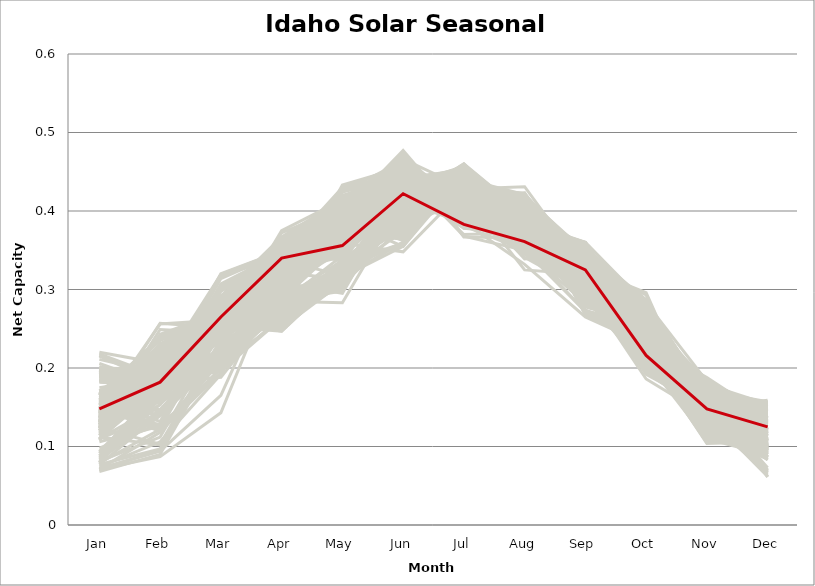
| Category | sample_001 | sample_002 | sample_003 | sample_004 | sample_005 | sample_006 | sample_007 | sample_008 | sample_009 | sample_010 | sample_011 | sample_012 | sample_013 | sample_014 | sample_015 | sample_016 | sample_017 | sample_018 | sample_019 | sample_020 | sample_021 | sample_022 | sample_023 | sample_024 | sample_025 | sample_026 | sample_027 | sample_028 | sample_029 | sample_030 | sample_031 | sample_032 | sample_033 | sample_034 | sample_035 | sample_036 | sample_037 | sample_038 | sample_039 | sample_040 | sample_041 | sample_042 | sample_043 | sample_044 | sample_045 | sample_046 | sample_047 | sample_048 | sample_049 | sample_050 | sample_051 | sample_052 | sample_053 | sample_054 | sample_055 | sample_056 | sample_057 | sample_058 | sample_059 | sample_060 | sample_061 | sample_062 | sample_063 | sample_064 | sample_065 | sample_066 | sample_067 | sample_068 | sample_069 | sample_070 | sample_071 | sample_072 | sample_073 | sample_074 | sample_075 | sample_076 | sample_077 | sample_078 | sample_079 | sample_080 | sample_081 | sample_082 | sample_083 | sample_084 | sample_085 | sample_086 | sample_087 | sample_088 | sample_089 | sample_090 | sample_091 | sample_092 | sample_093 | sample_094 | sample_095 | sample_096 | sample_097 | sample_098 | sample_099 | sample_100 | sample_101 | sample_102 | sample_103 | sample_104 | sample_105 | sample_106 | sample_107 | sample_108 | sample_109 | sample_110 | sample_111 | sample_112 | sample_113 | sample_114 | sample_115 | sample_116 | sample_117 | sample_118 | sample_119 | sample_120 | sample_121 | sample_122 | sample_123 | sample_124 | sample_125 | sample_126 | sample_127 | sample_128 | sample_129 | sample_130 | sample_131 | sample_132 | sample_133 | sample_134 | sample_135 | sample_136 | sample_137 | sample_138 | sample_139 | sample_140 | sample_141 | sample_142 | sample_143 | sample_144 | sample_145 | sample_146 | sample_147 | sample_148 | sample_149 | sample_150 | sample_151 | sample_152 | sample_153 | sample_154 | sample_155 | sample_156 | sample_157 | sample_158 | sample_159 | sample_160 | sample_161 | sample_162 | sample_163 | sample_164 | sample_165 | sample_166 | sample_167 | sample_168 | sample_169 | sample_170 | sample_171 | sample_172 | sample_173 | sample_174 | sample_175 | sample_176 | sample_177 | sample_178 | sample_179 | sample_180 | sample_181 | sample_183 | sample_184 | sample_185 | sample_186 | sample_187 | sample_188 | sample_189 | sample_190 | sample_191 | sample_192 | sample_193 | sample_194 | sample_195 | sample_196 | sample_197 | sample_198 | sample_199 | sample_200 | sample_201 | sample_202 | sample_203 | sample_204 | sample_205 | sample_206 | sample_207 | sample_208 | sample_209 | sample_210 | sample_211 | sample_212 | sample_213 | sample_214 | sample_215 | sample_216 | sample_217 | sample_218 | sample_219 | sample_220 | sample_221 | sample_222 | sample_223 | sample_224 | sample_225 | sample_226 | sample_227 | sample_228 | sample_229 | sample_230 | sample_231 | sample_232 | sample_233 | sample_234 | sample_235 | sample_236 | sample_237 | sample_238 | sample_239 | sample_240 | sample_241 | sample_242 | sample_243 | sample_244 | sample_245 | sample_246 | sample_247 | sample_248 | sample_249 | sample_250 | sample_182 |
|---|---|---|---|---|---|---|---|---|---|---|---|---|---|---|---|---|---|---|---|---|---|---|---|---|---|---|---|---|---|---|---|---|---|---|---|---|---|---|---|---|---|---|---|---|---|---|---|---|---|---|---|---|---|---|---|---|---|---|---|---|---|---|---|---|---|---|---|---|---|---|---|---|---|---|---|---|---|---|---|---|---|---|---|---|---|---|---|---|---|---|---|---|---|---|---|---|---|---|---|---|---|---|---|---|---|---|---|---|---|---|---|---|---|---|---|---|---|---|---|---|---|---|---|---|---|---|---|---|---|---|---|---|---|---|---|---|---|---|---|---|---|---|---|---|---|---|---|---|---|---|---|---|---|---|---|---|---|---|---|---|---|---|---|---|---|---|---|---|---|---|---|---|---|---|---|---|---|---|---|---|---|---|---|---|---|---|---|---|---|---|---|---|---|---|---|---|---|---|---|---|---|---|---|---|---|---|---|---|---|---|---|---|---|---|---|---|---|---|---|---|---|---|---|---|---|---|---|---|---|---|---|---|---|---|---|---|---|---|---|---|---|---|---|---|---|---|---|---|---|---|
| Jan | 0.11 | 0.167 | 0.142 | 0.191 | 0.166 | 0.171 | 0.114 | 0.192 | 0.164 | 0.079 | 0.137 | 0.138 | 0.163 | 0.128 | 0.199 | 0.142 | 0.15 | 0.182 | 0.185 | 0.12 | 0.137 | 0.12 | 0.133 | 0.169 | 0.159 | 0.132 | 0.132 | 0.166 | 0.143 | 0.127 | 0.137 | 0.126 | 0.124 | 0.117 | 0.145 | 0.147 | 0.131 | 0.143 | 0.124 | 0.215 | 0.138 | 0.149 | 0.188 | 0.166 | 0.145 | 0.109 | 0.2 | 0.199 | 0.079 | 0.155 | 0.131 | 0.116 | 0.141 | 0.159 | 0.16 | 0.216 | 0.211 | 0.136 | 0.152 | 0.13 | 0.098 | 0.124 | 0.13 | 0.123 | 0.146 | 0.109 | 0.077 | 0.154 | 0.132 | 0.148 | 0.133 | 0.153 | 0.126 | 0.091 | 0.169 | 0.146 | 0.093 | 0.156 | 0.162 | 0.132 | 0.192 | 0.138 | 0.184 | 0.195 | 0.134 | 0.171 | 0.088 | 0.191 | 0.147 | 0.132 | 0.133 | 0.137 | 0.142 | 0.123 | 0.157 | 0.132 | 0.189 | 0.094 | 0.159 | 0.142 | 0.071 | 0.068 | 0.121 | 0.128 | 0.138 | 0.13 | 0.11 | 0.145 | 0.112 | 0.22 | 0.147 | 0.19 | 0.202 | 0.197 | 0.171 | 0.131 | 0.121 | 0.12 | 0.14 | 0.11 | 0.125 | 0.13 | 0.167 | 0.149 | 0.149 | 0.128 | 0.129 | 0.136 | 0.135 | 0.154 | 0.196 | 0.083 | 0.077 | 0.175 | 0.127 | 0.074 | 0.118 | 0.072 | 0.126 | 0.165 | 0.135 | 0.131 | 0.141 | 0.206 | 0.157 | 0.148 | 0.158 | 0.132 | 0.144 | 0.13 | 0.14 | 0.114 | 0.128 | 0.12 | 0.197 | 0.071 | 0.132 | 0.135 | 0.15 | 0.153 | 0.123 | 0.218 | 0.158 | 0.132 | 0.135 | 0.131 | 0.137 | 0.132 | 0.152 | 0.2 | 0.08 | 0.14 | 0.139 | 0.133 | 0.134 | 0.08 | 0.146 | 0.13 | 0.158 | 0.135 | 0.128 | 0.141 | 0.136 | 0.157 | 0.124 | 0.135 | 0.171 | 0.143 | 0.137 | 0.143 | 0.159 | 0.123 | 0.071 | 0.153 | 0.125 | 0.165 | 0.135 | 0.136 | 0.165 | 0.133 | 0.11 | 0.136 | 0.163 | 0.14 | 0.131 | 0.132 | 0.164 | 0.185 | 0.146 | 0.171 | 0.135 | 0.154 | 0.135 | 0.144 | 0.139 | 0.124 | 0.106 | 0.13 | 0.156 | 0.137 | 0.143 | 0.12 | 0.144 | 0.132 | 0.13 | 0.124 | 0.153 | 0.149 | 0.153 | 0.081 | 0.084 | 0.086 | 0.108 | 0.131 | 0.147 | 0.149 | 0.171 | 0.126 | 0.195 | 0.198 | 0.123 | 0.165 | 0.125 | 0.088 | 0.123 | 0.183 | 0.164 | 0.165 | 0.139 | 0.148 |
| Feb | 0.14 | 0.198 | 0.24 | 0.194 | 0.214 | 0.171 | 0.197 | 0.164 | 0.184 | 0.122 | 0.221 | 0.209 | 0.189 | 0.249 | 0.178 | 0.221 | 0.119 | 0.178 | 0.169 | 0.208 | 0.166 | 0.191 | 0.222 | 0.172 | 0.183 | 0.202 | 0.179 | 0.205 | 0.213 | 0.215 | 0.167 | 0.18 | 0.103 | 0.181 | 0.178 | 0.213 | 0.213 | 0.211 | 0.179 | 0.185 | 0.178 | 0.186 | 0.196 | 0.238 | 0.24 | 0.191 | 0.182 | 0.172 | 0.161 | 0.172 | 0.205 | 0.198 | 0.195 | 0.209 | 0.23 | 0.179 | 0.193 | 0.2 | 0.18 | 0.167 | 0.129 | 0.209 | 0.198 | 0.197 | 0.141 | 0.18 | 0.141 | 0.225 | 0.217 | 0.215 | 0.175 | 0.126 | 0.185 | 0.178 | 0.192 | 0.229 | 0.168 | 0.197 | 0.178 | 0.163 | 0.188 | 0.172 | 0.193 | 0.155 | 0.198 | 0.187 | 0.147 | 0.188 | 0.182 | 0.191 | 0.186 | 0.197 | 0.218 | 0.212 | 0.209 | 0.207 | 0.168 | 0.171 | 0.215 | 0.17 | 0.118 | 0.09 | 0.216 | 0.191 | 0.19 | 0.18 | 0.175 | 0.179 | 0.102 | 0.206 | 0.156 | 0.164 | 0.185 | 0.159 | 0.176 | 0.165 | 0.171 | 0.189 | 0.19 | 0.18 | 0.214 | 0.176 | 0.239 | 0.19 | 0.218 | 0.217 | 0.197 | 0.168 | 0.178 | 0.188 | 0.178 | 0.139 | 0.097 | 0.188 | 0.186 | 0.106 | 0.188 | 0.094 | 0.161 | 0.199 | 0.179 | 0.189 | 0.173 | 0.178 | 0.181 | 0.126 | 0.185 | 0.177 | 0.256 | 0.177 | 0.216 | 0.191 | 0.243 | 0.194 | 0.204 | 0.095 | 0.17 | 0.183 | 0.183 | 0.179 | 0.212 | 0.189 | 0.181 | 0.21 | 0.183 | 0.223 | 0.191 | 0.221 | 0.219 | 0.198 | 0.162 | 0.168 | 0.169 | 0.186 | 0.181 | 0.169 | 0.186 | 0.227 | 0.18 | 0.165 | 0.203 | 0.178 | 0.183 | 0.132 | 0.183 | 0.191 | 0.177 | 0.173 | 0.203 | 0.128 | 0.122 | 0.188 | 0.087 | 0.23 | 0.212 | 0.237 | 0.215 | 0.176 | 0.123 | 0.158 | 0.153 | 0.188 | 0.167 | 0.228 | 0.196 | 0.183 | 0.184 | 0.199 | 0.164 | 0.166 | 0.173 | 0.14 | 0.161 | 0.182 | 0.198 | 0.177 | 0.126 | 0.198 | 0.145 | 0.257 | 0.209 | 0.215 | 0.176 | 0.205 | 0.187 | 0.175 | 0.179 | 0.21 | 0.147 | 0.112 | 0.143 | 0.154 | 0.194 | 0.19 | 0.124 | 0.182 | 0.218 | 0.159 | 0.166 | 0.168 | 0.182 | 0.235 | 0.194 | 0.166 | 0.174 | 0.168 | 0.186 | 0.195 | 0.231 | 0.182 |
| Mar | 0.277 | 0.319 | 0.263 | 0.26 | 0.282 | 0.21 | 0.253 | 0.284 | 0.256 | 0.213 | 0.273 | 0.251 | 0.273 | 0.245 | 0.284 | 0.255 | 0.194 | 0.283 | 0.279 | 0.265 | 0.282 | 0.255 | 0.255 | 0.287 | 0.271 | 0.27 | 0.214 | 0.26 | 0.253 | 0.266 | 0.263 | 0.252 | 0.237 | 0.273 | 0.316 | 0.258 | 0.25 | 0.255 | 0.272 | 0.292 | 0.213 | 0.269 | 0.265 | 0.274 | 0.269 | 0.26 | 0.285 | 0.278 | 0.225 | 0.304 | 0.26 | 0.259 | 0.255 | 0.276 | 0.261 | 0.29 | 0.286 | 0.285 | 0.259 | 0.25 | 0.262 | 0.255 | 0.25 | 0.264 | 0.242 | 0.246 | 0.21 | 0.265 | 0.258 | 0.263 | 0.271 | 0.268 | 0.223 | 0.24 | 0.303 | 0.276 | 0.225 | 0.259 | 0.258 | 0.258 | 0.28 | 0.25 | 0.271 | 0.282 | 0.257 | 0.259 | 0.23 | 0.273 | 0.259 | 0.254 | 0.201 | 0.259 | 0.249 | 0.247 | 0.268 | 0.269 | 0.276 | 0.239 | 0.282 | 0.298 | 0.209 | 0.227 | 0.271 | 0.241 | 0.201 | 0.199 | 0.255 | 0.32 | 0.229 | 0.282 | 0.217 | 0.277 | 0.281 | 0.277 | 0.268 | 0.274 | 0.254 | 0.199 | 0.249 | 0.247 | 0.274 | 0.301 | 0.268 | 0.318 | 0.24 | 0.252 | 0.264 | 0.3 | 0.264 | 0.268 | 0.283 | 0.229 | 0.23 | 0.281 | 0.209 | 0.192 | 0.263 | 0.165 | 0.255 | 0.271 | 0.317 | 0.27 | 0.201 | 0.279 | 0.264 | 0.26 | 0.201 | 0.259 | 0.261 | 0.259 | 0.258 | 0.256 | 0.271 | 0.263 | 0.282 | 0.232 | 0.271 | 0.276 | 0.197 | 0.204 | 0.252 | 0.291 | 0.258 | 0.275 | 0.261 | 0.262 | 0.266 | 0.25 | 0.252 | 0.281 | 0.237 | 0.298 | 0.284 | 0.26 | 0.258 | 0.251 | 0.21 | 0.269 | 0.3 | 0.301 | 0.247 | 0.314 | 0.253 | 0.266 | 0.196 | 0.257 | 0.269 | 0.207 | 0.261 | 0.193 | 0.2 | 0.282 | 0.143 | 0.269 | 0.243 | 0.255 | 0.258 | 0.263 | 0.257 | 0.265 | 0.257 | 0.256 | 0.207 | 0.272 | 0.263 | 0.248 | 0.271 | 0.284 | 0.252 | 0.272 | 0.307 | 0.21 | 0.28 | 0.188 | 0.281 | 0.248 | 0.255 | 0.249 | 0.215 | 0.251 | 0.269 | 0.26 | 0.205 | 0.271 | 0.268 | 0.244 | 0.203 | 0.27 | 0.206 | 0.246 | 0.221 | 0.224 | 0.268 | 0.2 | 0.199 | 0.208 | 0.276 | 0.257 | 0.291 | 0.279 | 0.26 | 0.267 | 0.255 | 0.249 | 0.255 | 0.278 | 0.206 | 0.317 | 0.267 | 0.265 |
| Apr | 0.348 | 0.349 | 0.345 | 0.301 | 0.357 | 0.309 | 0.247 | 0.359 | 0.315 | 0.292 | 0.316 | 0.261 | 0.313 | 0.375 | 0.352 | 0.293 | 0.309 | 0.306 | 0.35 | 0.291 | 0.338 | 0.256 | 0.282 | 0.311 | 0.308 | 0.316 | 0.275 | 0.315 | 0.291 | 0.332 | 0.324 | 0.331 | 0.296 | 0.29 | 0.348 | 0.251 | 0.271 | 0.29 | 0.323 | 0.349 | 0.282 | 0.341 | 0.3 | 0.333 | 0.348 | 0.248 | 0.354 | 0.356 | 0.298 | 0.346 | 0.247 | 0.254 | 0.334 | 0.346 | 0.344 | 0.345 | 0.356 | 0.282 | 0.33 | 0.321 | 0.333 | 0.33 | 0.267 | 0.283 | 0.335 | 0.287 | 0.283 | 0.34 | 0.335 | 0.344 | 0.306 | 0.356 | 0.279 | 0.274 | 0.326 | 0.336 | 0.28 | 0.349 | 0.314 | 0.321 | 0.327 | 0.323 | 0.289 | 0.365 | 0.332 | 0.326 | 0.283 | 0.296 | 0.294 | 0.335 | 0.263 | 0.263 | 0.287 | 0.271 | 0.352 | 0.28 | 0.34 | 0.287 | 0.365 | 0.35 | 0.3 | 0.327 | 0.31 | 0.343 | 0.274 | 0.264 | 0.259 | 0.349 | 0.293 | 0.354 | 0.323 | 0.351 | 0.346 | 0.358 | 0.301 | 0.348 | 0.32 | 0.264 | 0.34 | 0.298 | 0.326 | 0.348 | 0.338 | 0.341 | 0.28 | 0.279 | 0.347 | 0.335 | 0.302 | 0.3 | 0.357 | 0.282 | 0.329 | 0.31 | 0.269 | 0.318 | 0.252 | 0.336 | 0.317 | 0.287 | 0.346 | 0.311 | 0.279 | 0.36 | 0.305 | 0.32 | 0.293 | 0.298 | 0.364 | 0.249 | 0.294 | 0.257 | 0.353 | 0.319 | 0.323 | 0.326 | 0.337 | 0.34 | 0.29 | 0.323 | 0.33 | 0.344 | 0.313 | 0.346 | 0.339 | 0.288 | 0.351 | 0.278 | 0.28 | 0.343 | 0.289 | 0.34 | 0.337 | 0.352 | 0.311 | 0.293 | 0.289 | 0.353 | 0.331 | 0.336 | 0.263 | 0.348 | 0.293 | 0.358 | 0.263 | 0.351 | 0.291 | 0.286 | 0.337 | 0.311 | 0.315 | 0.29 | 0.333 | 0.345 | 0.269 | 0.343 | 0.285 | 0.256 | 0.313 | 0.347 | 0.337 | 0.336 | 0.302 | 0.339 | 0.341 | 0.293 | 0.298 | 0.304 | 0.312 | 0.311 | 0.347 | 0.332 | 0.33 | 0.286 | 0.301 | 0.325 | 0.324 | 0.265 | 0.325 | 0.372 | 0.358 | 0.33 | 0.277 | 0.344 | 0.344 | 0.292 | 0.296 | 0.347 | 0.333 | 0.311 | 0.286 | 0.284 | 0.284 | 0.279 | 0.307 | 0.285 | 0.354 | 0.336 | 0.367 | 0.364 | 0.299 | 0.34 | 0.337 | 0.296 | 0.252 | 0.337 | 0.285 | 0.345 | 0.331 | 0.34 |
| May | 0.359 | 0.358 | 0.407 | 0.377 | 0.346 | 0.295 | 0.32 | 0.416 | 0.364 | 0.365 | 0.407 | 0.306 | 0.384 | 0.414 | 0.404 | 0.317 | 0.368 | 0.397 | 0.409 | 0.411 | 0.359 | 0.332 | 0.323 | 0.414 | 0.415 | 0.368 | 0.328 | 0.35 | 0.314 | 0.416 | 0.381 | 0.38 | 0.413 | 0.388 | 0.366 | 0.309 | 0.328 | 0.328 | 0.342 | 0.424 | 0.311 | 0.365 | 0.373 | 0.383 | 0.412 | 0.337 | 0.399 | 0.42 | 0.391 | 0.369 | 0.32 | 0.333 | 0.391 | 0.351 | 0.366 | 0.43 | 0.412 | 0.424 | 0.371 | 0.366 | 0.41 | 0.383 | 0.331 | 0.418 | 0.365 | 0.373 | 0.343 | 0.387 | 0.387 | 0.34 | 0.394 | 0.369 | 0.326 | 0.405 | 0.356 | 0.41 | 0.38 | 0.354 | 0.379 | 0.373 | 0.403 | 0.389 | 0.361 | 0.41 | 0.397 | 0.361 | 0.373 | 0.377 | 0.37 | 0.385 | 0.31 | 0.325 | 0.331 | 0.337 | 0.36 | 0.407 | 0.403 | 0.41 | 0.343 | 0.365 | 0.37 | 0.405 | 0.411 | 0.381 | 0.308 | 0.313 | 0.333 | 0.371 | 0.419 | 0.412 | 0.379 | 0.411 | 0.427 | 0.416 | 0.399 | 0.348 | 0.382 | 0.32 | 0.38 | 0.373 | 0.414 | 0.372 | 0.377 | 0.36 | 0.327 | 0.316 | 0.375 | 0.375 | 0.394 | 0.375 | 0.4 | 0.382 | 0.403 | 0.407 | 0.322 | 0.402 | 0.329 | 0.391 | 0.375 | 0.359 | 0.369 | 0.349 | 0.303 | 0.397 | 0.382 | 0.361 | 0.298 | 0.383 | 0.399 | 0.316 | 0.321 | 0.339 | 0.415 | 0.366 | 0.39 | 0.399 | 0.318 | 0.376 | 0.301 | 0.312 | 0.377 | 0.415 | 0.385 | 0.368 | 0.396 | 0.337 | 0.394 | 0.317 | 0.303 | 0.39 | 0.408 | 0.368 | 0.359 | 0.375 | 0.367 | 0.426 | 0.31 | 0.409 | 0.353 | 0.377 | 0.339 | 0.369 | 0.372 | 0.393 | 0.305 | 0.384 | 0.399 | 0.314 | 0.4 | 0.379 | 0.358 | 0.433 | 0.372 | 0.383 | 0.331 | 0.376 | 0.321 | 0.316 | 0.374 | 0.373 | 0.402 | 0.39 | 0.309 | 0.385 | 0.367 | 0.372 | 0.409 | 0.386 | 0.371 | 0.402 | 0.369 | 0.35 | 0.367 | 0.298 | 0.35 | 0.373 | 0.411 | 0.324 | 0.364 | 0.405 | 0.341 | 0.39 | 0.304 | 0.358 | 0.373 | 0.367 | 0.304 | 0.355 | 0.358 | 0.397 | 0.371 | 0.376 | 0.428 | 0.309 | 0.367 | 0.302 | 0.336 | 0.367 | 0.415 | 0.412 | 0.384 | 0.374 | 0.397 | 0.429 | 0.333 | 0.401 | 0.283 | 0.359 | 0.403 | 0.356 |
| Jun | 0.466 | 0.414 | 0.454 | 0.372 | 0.442 | 0.429 | 0.384 | 0.446 | 0.405 | 0.435 | 0.453 | 0.381 | 0.384 | 0.44 | 0.448 | 0.422 | 0.449 | 0.4 | 0.446 | 0.46 | 0.432 | 0.377 | 0.423 | 0.444 | 0.436 | 0.41 | 0.407 | 0.411 | 0.431 | 0.466 | 0.424 | 0.463 | 0.423 | 0.355 | 0.412 | 0.38 | 0.411 | 0.427 | 0.414 | 0.464 | 0.411 | 0.439 | 0.37 | 0.434 | 0.461 | 0.38 | 0.449 | 0.443 | 0.443 | 0.424 | 0.374 | 0.377 | 0.47 | 0.44 | 0.415 | 0.458 | 0.44 | 0.443 | 0.425 | 0.438 | 0.447 | 0.412 | 0.388 | 0.444 | 0.456 | 0.374 | 0.431 | 0.434 | 0.416 | 0.44 | 0.368 | 0.445 | 0.412 | 0.442 | 0.422 | 0.452 | 0.438 | 0.426 | 0.404 | 0.417 | 0.448 | 0.405 | 0.381 | 0.443 | 0.477 | 0.415 | 0.442 | 0.381 | 0.366 | 0.464 | 0.396 | 0.382 | 0.413 | 0.396 | 0.432 | 0.439 | 0.45 | 0.445 | 0.449 | 0.419 | 0.437 | 0.454 | 0.466 | 0.466 | 0.396 | 0.397 | 0.359 | 0.415 | 0.421 | 0.445 | 0.454 | 0.443 | 0.444 | 0.439 | 0.381 | 0.434 | 0.441 | 0.397 | 0.459 | 0.379 | 0.459 | 0.415 | 0.428 | 0.415 | 0.398 | 0.421 | 0.43 | 0.426 | 0.362 | 0.38 | 0.446 | 0.441 | 0.45 | 0.44 | 0.404 | 0.444 | 0.384 | 0.446 | 0.426 | 0.348 | 0.414 | 0.412 | 0.414 | 0.443 | 0.372 | 0.428 | 0.422 | 0.376 | 0.449 | 0.355 | 0.432 | 0.383 | 0.456 | 0.412 | 0.447 | 0.457 | 0.445 | 0.434 | 0.419 | 0.425 | 0.419 | 0.462 | 0.374 | 0.442 | 0.474 | 0.434 | 0.474 | 0.426 | 0.429 | 0.444 | 0.449 | 0.423 | 0.438 | 0.471 | 0.412 | 0.445 | 0.425 | 0.459 | 0.427 | 0.43 | 0.392 | 0.417 | 0.375 | 0.417 | 0.394 | 0.471 | 0.377 | 0.411 | 0.468 | 0.434 | 0.435 | 0.456 | 0.434 | 0.421 | 0.396 | 0.419 | 0.426 | 0.36 | 0.389 | 0.428 | 0.448 | 0.473 | 0.436 | 0.444 | 0.427 | 0.364 | 0.38 | 0.432 | 0.395 | 0.378 | 0.413 | 0.444 | 0.425 | 0.42 | 0.407 | 0.462 | 0.43 | 0.36 | 0.448 | 0.437 | 0.444 | 0.411 | 0.411 | 0.438 | 0.425 | 0.368 | 0.429 | 0.446 | 0.46 | 0.444 | 0.433 | 0.439 | 0.449 | 0.403 | 0.44 | 0.407 | 0.443 | 0.427 | 0.443 | 0.439 | 0.365 | 0.433 | 0.469 | 0.447 | 0.356 | 0.448 | 0.414 | 0.41 | 0.457 | 0.422 |
| Jul | 0.43 | 0.397 | 0.405 | 0.444 | 0.441 | 0.395 | 0.44 | 0.413 | 0.437 | 0.453 | 0.411 | 0.414 | 0.441 | 0.41 | 0.42 | 0.43 | 0.397 | 0.431 | 0.426 | 0.417 | 0.394 | 0.442 | 0.422 | 0.427 | 0.434 | 0.458 | 0.442 | 0.441 | 0.423 | 0.4 | 0.382 | 0.391 | 0.397 | 0.446 | 0.398 | 0.419 | 0.44 | 0.42 | 0.451 | 0.383 | 0.444 | 0.43 | 0.437 | 0.433 | 0.405 | 0.448 | 0.416 | 0.399 | 0.444 | 0.39 | 0.443 | 0.441 | 0.391 | 0.435 | 0.442 | 0.383 | 0.395 | 0.41 | 0.437 | 0.393 | 0.399 | 0.456 | 0.445 | 0.424 | 0.386 | 0.442 | 0.457 | 0.429 | 0.451 | 0.436 | 0.44 | 0.386 | 0.444 | 0.43 | 0.399 | 0.403 | 0.446 | 0.433 | 0.434 | 0.388 | 0.421 | 0.441 | 0.437 | 0.414 | 0.387 | 0.434 | 0.452 | 0.436 | 0.442 | 0.395 | 0.436 | 0.441 | 0.431 | 0.441 | 0.441 | 0.417 | 0.426 | 0.427 | 0.426 | 0.4 | 0.455 | 0.417 | 0.412 | 0.4 | 0.438 | 0.444 | 0.458 | 0.397 | 0.406 | 0.387 | 0.39 | 0.425 | 0.394 | 0.402 | 0.439 | 0.387 | 0.401 | 0.446 | 0.383 | 0.43 | 0.406 | 0.399 | 0.437 | 0.395 | 0.423 | 0.432 | 0.443 | 0.397 | 0.445 | 0.437 | 0.418 | 0.445 | 0.411 | 0.43 | 0.445 | 0.423 | 0.443 | 0.427 | 0.379 | 0.427 | 0.401 | 0.455 | 0.442 | 0.403 | 0.448 | 0.423 | 0.419 | 0.433 | 0.407 | 0.451 | 0.427 | 0.451 | 0.402 | 0.46 | 0.425 | 0.408 | 0.37 | 0.434 | 0.432 | 0.408 | 0.451 | 0.384 | 0.448 | 0.441 | 0.389 | 0.424 | 0.378 | 0.428 | 0.415 | 0.416 | 0.425 | 0.396 | 0.384 | 0.367 | 0.385 | 0.425 | 0.424 | 0.397 | 0.39 | 0.4 | 0.441 | 0.391 | 0.431 | 0.415 | 0.449 | 0.389 | 0.441 | 0.442 | 0.399 | 0.41 | 0.388 | 0.411 | 0.428 | 0.435 | 0.444 | 0.44 | 0.429 | 0.453 | 0.423 | 0.385 | 0.404 | 0.387 | 0.403 | 0.433 | 0.441 | 0.435 | 0.445 | 0.426 | 0.439 | 0.45 | 0.394 | 0.381 | 0.391 | 0.431 | 0.453 | 0.41 | 0.405 | 0.457 | 0.368 | 0.401 | 0.437 | 0.46 | 0.452 | 0.447 | 0.442 | 0.441 | 0.41 | 0.435 | 0.383 | 0.421 | 0.453 | 0.452 | 0.426 | 0.441 | 0.412 | 0.423 | 0.447 | 0.378 | 0.407 | 0.397 | 0.437 | 0.435 | 0.393 | 0.417 | 0.459 | 0.426 | 0.409 | 0.395 | 0.401 | 0.383 |
| Aug | 0.367 | 0.351 | 0.413 | 0.366 | 0.373 | 0.403 | 0.391 | 0.382 | 0.417 | 0.383 | 0.411 | 0.372 | 0.367 | 0.418 | 0.372 | 0.38 | 0.366 | 0.357 | 0.375 | 0.412 | 0.367 | 0.388 | 0.383 | 0.383 | 0.38 | 0.382 | 0.389 | 0.41 | 0.384 | 0.416 | 0.367 | 0.406 | 0.404 | 0.396 | 0.352 | 0.375 | 0.386 | 0.379 | 0.386 | 0.361 | 0.385 | 0.407 | 0.363 | 0.389 | 0.417 | 0.391 | 0.369 | 0.376 | 0.349 | 0.358 | 0.387 | 0.389 | 0.377 | 0.38 | 0.395 | 0.372 | 0.374 | 0.41 | 0.412 | 0.408 | 0.374 | 0.382 | 0.382 | 0.402 | 0.354 | 0.398 | 0.39 | 0.393 | 0.381 | 0.384 | 0.378 | 0.332 | 0.386 | 0.358 | 0.359 | 0.41 | 0.351 | 0.406 | 0.417 | 0.372 | 0.371 | 0.421 | 0.362 | 0.376 | 0.38 | 0.41 | 0.361 | 0.359 | 0.393 | 0.391 | 0.4 | 0.379 | 0.384 | 0.383 | 0.382 | 0.411 | 0.378 | 0.354 | 0.38 | 0.368 | 0.385 | 0.41 | 0.404 | 0.399 | 0.394 | 0.401 | 0.396 | 0.345 | 0.406 | 0.37 | 0.37 | 0.373 | 0.379 | 0.375 | 0.366 | 0.367 | 0.415 | 0.397 | 0.398 | 0.398 | 0.416 | 0.368 | 0.389 | 0.359 | 0.379 | 0.383 | 0.399 | 0.367 | 0.381 | 0.383 | 0.368 | 0.36 | 0.414 | 0.37 | 0.387 | 0.408 | 0.391 | 0.423 | 0.377 | 0.372 | 0.355 | 0.383 | 0.387 | 0.378 | 0.376 | 0.339 | 0.379 | 0.393 | 0.416 | 0.394 | 0.379 | 0.39 | 0.423 | 0.381 | 0.376 | 0.412 | 0.372 | 0.408 | 0.388 | 0.402 | 0.392 | 0.364 | 0.374 | 0.387 | 0.374 | 0.386 | 0.379 | 0.385 | 0.369 | 0.373 | 0.36 | 0.374 | 0.369 | 0.366 | 0.388 | 0.348 | 0.401 | 0.419 | 0.364 | 0.367 | 0.378 | 0.354 | 0.391 | 0.341 | 0.402 | 0.375 | 0.363 | 0.376 | 0.381 | 0.372 | 0.369 | 0.412 | 0.431 | 0.395 | 0.39 | 0.39 | 0.384 | 0.393 | 0.325 | 0.366 | 0.385 | 0.382 | 0.403 | 0.392 | 0.41 | 0.39 | 0.369 | 0.371 | 0.418 | 0.369 | 0.348 | 0.35 | 0.371 | 0.389 | 0.38 | 0.409 | 0.382 | 0.391 | 0.35 | 0.41 | 0.387 | 0.396 | 0.385 | 0.385 | 0.381 | 0.392 | 0.402 | 0.385 | 0.374 | 0.4 | 0.366 | 0.357 | 0.418 | 0.399 | 0.373 | 0.384 | 0.378 | 0.371 | 0.373 | 0.38 | 0.394 | 0.391 | 0.394 | 0.346 | 0.396 | 0.379 | 0.372 | 0.354 | 0.415 | 0.361 |
| Sep | 0.338 | 0.302 | 0.299 | 0.326 | 0.318 | 0.337 | 0.347 | 0.309 | 0.346 | 0.327 | 0.321 | 0.349 | 0.342 | 0.27 | 0.314 | 0.34 | 0.301 | 0.32 | 0.311 | 0.318 | 0.313 | 0.349 | 0.337 | 0.324 | 0.325 | 0.344 | 0.349 | 0.343 | 0.333 | 0.313 | 0.318 | 0.331 | 0.354 | 0.348 | 0.303 | 0.35 | 0.351 | 0.334 | 0.36 | 0.289 | 0.359 | 0.332 | 0.332 | 0.298 | 0.306 | 0.345 | 0.312 | 0.299 | 0.333 | 0.289 | 0.352 | 0.344 | 0.307 | 0.33 | 0.312 | 0.3 | 0.304 | 0.319 | 0.345 | 0.339 | 0.338 | 0.33 | 0.355 | 0.321 | 0.272 | 0.348 | 0.328 | 0.295 | 0.328 | 0.33 | 0.347 | 0.265 | 0.359 | 0.321 | 0.291 | 0.309 | 0.336 | 0.338 | 0.347 | 0.33 | 0.32 | 0.343 | 0.325 | 0.306 | 0.308 | 0.337 | 0.339 | 0.322 | 0.345 | 0.334 | 0.347 | 0.356 | 0.348 | 0.36 | 0.335 | 0.314 | 0.324 | 0.322 | 0.313 | 0.294 | 0.327 | 0.269 | 0.313 | 0.339 | 0.351 | 0.349 | 0.349 | 0.298 | 0.346 | 0.305 | 0.278 | 0.31 | 0.307 | 0.311 | 0.321 | 0.31 | 0.34 | 0.352 | 0.329 | 0.342 | 0.313 | 0.295 | 0.295 | 0.302 | 0.35 | 0.342 | 0.342 | 0.289 | 0.349 | 0.352 | 0.307 | 0.334 | 0.274 | 0.324 | 0.35 | 0.304 | 0.351 | 0.32 | 0.313 | 0.36 | 0.3 | 0.351 | 0.353 | 0.309 | 0.34 | 0.345 | 0.35 | 0.348 | 0.286 | 0.351 | 0.336 | 0.355 | 0.293 | 0.343 | 0.329 | 0.268 | 0.326 | 0.331 | 0.349 | 0.329 | 0.328 | 0.287 | 0.339 | 0.336 | 0.318 | 0.336 | 0.308 | 0.339 | 0.336 | 0.32 | 0.318 | 0.29 | 0.313 | 0.311 | 0.313 | 0.325 | 0.353 | 0.296 | 0.303 | 0.29 | 0.358 | 0.294 | 0.346 | 0.298 | 0.352 | 0.324 | 0.32 | 0.355 | 0.302 | 0.308 | 0.299 | 0.317 | 0.325 | 0.317 | 0.357 | 0.3 | 0.345 | 0.349 | 0.319 | 0.326 | 0.346 | 0.32 | 0.336 | 0.293 | 0.334 | 0.343 | 0.322 | 0.331 | 0.348 | 0.327 | 0.3 | 0.283 | 0.309 | 0.354 | 0.351 | 0.335 | 0.344 | 0.342 | 0.272 | 0.268 | 0.321 | 0.335 | 0.36 | 0.326 | 0.344 | 0.342 | 0.346 | 0.327 | 0.281 | 0.278 | 0.336 | 0.337 | 0.318 | 0.347 | 0.31 | 0.35 | 0.323 | 0.326 | 0.302 | 0.313 | 0.348 | 0.303 | 0.338 | 0.33 | 0.345 | 0.326 | 0.346 | 0.305 | 0.311 | 0.325 |
| Oct | 0.21 | 0.186 | 0.24 | 0.225 | 0.238 | 0.225 | 0.247 | 0.233 | 0.278 | 0.281 | 0.243 | 0.232 | 0.222 | 0.228 | 0.235 | 0.219 | 0.249 | 0.22 | 0.237 | 0.243 | 0.212 | 0.255 | 0.209 | 0.244 | 0.252 | 0.274 | 0.252 | 0.272 | 0.223 | 0.24 | 0.221 | 0.228 | 0.283 | 0.232 | 0.199 | 0.233 | 0.229 | 0.221 | 0.281 | 0.249 | 0.242 | 0.269 | 0.215 | 0.211 | 0.241 | 0.252 | 0.229 | 0.235 | 0.251 | 0.199 | 0.252 | 0.25 | 0.228 | 0.241 | 0.238 | 0.243 | 0.232 | 0.254 | 0.272 | 0.24 | 0.238 | 0.248 | 0.236 | 0.265 | 0.249 | 0.246 | 0.293 | 0.221 | 0.245 | 0.236 | 0.219 | 0.23 | 0.243 | 0.229 | 0.199 | 0.229 | 0.244 | 0.262 | 0.278 | 0.231 | 0.235 | 0.282 | 0.228 | 0.237 | 0.217 | 0.27 | 0.252 | 0.225 | 0.231 | 0.216 | 0.263 | 0.236 | 0.221 | 0.231 | 0.247 | 0.267 | 0.24 | 0.23 | 0.232 | 0.207 | 0.296 | 0.252 | 0.239 | 0.224 | 0.253 | 0.257 | 0.268 | 0.196 | 0.283 | 0.232 | 0.258 | 0.237 | 0.232 | 0.233 | 0.227 | 0.211 | 0.24 | 0.25 | 0.218 | 0.247 | 0.236 | 0.205 | 0.214 | 0.195 | 0.222 | 0.223 | 0.258 | 0.211 | 0.223 | 0.223 | 0.231 | 0.243 | 0.243 | 0.245 | 0.249 | 0.241 | 0.25 | 0.26 | 0.247 | 0.224 | 0.198 | 0.287 | 0.241 | 0.229 | 0.229 | 0.27 | 0.229 | 0.242 | 0.225 | 0.273 | 0.229 | 0.243 | 0.233 | 0.273 | 0.24 | 0.243 | 0.258 | 0.269 | 0.231 | 0.222 | 0.245 | 0.251 | 0.23 | 0.242 | 0.221 | 0.218 | 0.219 | 0.221 | 0.215 | 0.237 | 0.239 | 0.208 | 0.204 | 0.21 | 0.249 | 0.226 | 0.226 | 0.235 | 0.204 | 0.206 | 0.229 | 0.199 | 0.25 | 0.254 | 0.261 | 0.209 | 0.228 | 0.238 | 0.218 | 0.255 | 0.248 | 0.253 | 0.269 | 0.232 | 0.229 | 0.231 | 0.229 | 0.272 | 0.273 | 0.221 | 0.235 | 0.216 | 0.226 | 0.21 | 0.268 | 0.243 | 0.229 | 0.236 | 0.286 | 0.227 | 0.201 | 0.262 | 0.211 | 0.242 | 0.281 | 0.235 | 0.241 | 0.258 | 0.261 | 0.235 | 0.242 | 0.249 | 0.239 | 0.236 | 0.252 | 0.258 | 0.228 | 0.238 | 0.256 | 0.254 | 0.263 | 0.24 | 0.265 | 0.256 | 0.251 | 0.243 | 0.241 | 0.226 | 0.234 | 0.231 | 0.238 | 0.219 | 0.215 | 0.229 | 0.274 | 0.24 | 0.236 | 0.192 | 0.233 | 0.216 |
| Nov | 0.13 | 0.139 | 0.134 | 0.17 | 0.142 | 0.149 | 0.134 | 0.164 | 0.16 | 0.127 | 0.145 | 0.14 | 0.171 | 0.156 | 0.183 | 0.106 | 0.161 | 0.164 | 0.175 | 0.15 | 0.151 | 0.138 | 0.109 | 0.18 | 0.183 | 0.143 | 0.167 | 0.147 | 0.111 | 0.139 | 0.149 | 0.142 | 0.183 | 0.181 | 0.144 | 0.139 | 0.121 | 0.106 | 0.145 | 0.145 | 0.167 | 0.14 | 0.174 | 0.142 | 0.14 | 0.138 | 0.178 | 0.159 | 0.12 | 0.146 | 0.138 | 0.138 | 0.126 | 0.141 | 0.143 | 0.153 | 0.16 | 0.165 | 0.154 | 0.153 | 0.14 | 0.138 | 0.144 | 0.161 | 0.142 | 0.177 | 0.128 | 0.146 | 0.134 | 0.138 | 0.177 | 0.136 | 0.163 | 0.118 | 0.155 | 0.142 | 0.117 | 0.138 | 0.163 | 0.151 | 0.184 | 0.156 | 0.166 | 0.174 | 0.119 | 0.15 | 0.119 | 0.169 | 0.188 | 0.138 | 0.179 | 0.142 | 0.121 | 0.134 | 0.144 | 0.157 | 0.171 | 0.126 | 0.139 | 0.149 | 0.122 | 0.161 | 0.143 | 0.134 | 0.171 | 0.17 | 0.14 | 0.147 | 0.167 | 0.154 | 0.158 | 0.18 | 0.149 | 0.165 | 0.162 | 0.147 | 0.153 | 0.168 | 0.152 | 0.172 | 0.141 | 0.141 | 0.145 | 0.141 | 0.137 | 0.109 | 0.13 | 0.157 | 0.183 | 0.174 | 0.176 | 0.121 | 0.163 | 0.186 | 0.161 | 0.167 | 0.137 | 0.155 | 0.151 | 0.18 | 0.141 | 0.149 | 0.166 | 0.166 | 0.172 | 0.179 | 0.158 | 0.182 | 0.15 | 0.139 | 0.11 | 0.142 | 0.143 | 0.141 | 0.181 | 0.163 | 0.137 | 0.137 | 0.157 | 0.147 | 0.136 | 0.142 | 0.174 | 0.134 | 0.126 | 0.105 | 0.128 | 0.104 | 0.112 | 0.172 | 0.117 | 0.152 | 0.149 | 0.129 | 0.152 | 0.122 | 0.158 | 0.133 | 0.15 | 0.15 | 0.139 | 0.146 | 0.179 | 0.156 | 0.179 | 0.129 | 0.16 | 0.165 | 0.112 | 0.164 | 0.156 | 0.166 | 0.156 | 0.143 | 0.131 | 0.143 | 0.113 | 0.139 | 0.161 | 0.149 | 0.132 | 0.124 | 0.151 | 0.144 | 0.13 | 0.183 | 0.162 | 0.186 | 0.164 | 0.167 | 0.145 | 0.152 | 0.152 | 0.158 | 0.147 | 0.146 | 0.143 | 0.146 | 0.158 | 0.152 | 0.14 | 0.141 | 0.163 | 0.132 | 0.137 | 0.185 | 0.157 | 0.138 | 0.15 | 0.154 | 0.122 | 0.121 | 0.159 | 0.175 | 0.161 | 0.166 | 0.147 | 0.147 | 0.164 | 0.163 | 0.18 | 0.144 | 0.137 | 0.11 | 0.145 | 0.176 | 0.165 | 0.15 | 0.139 | 0.148 |
| Dec | 0.116 | 0.116 | 0.13 | 0.128 | 0.094 | 0.159 | 0.092 | 0.1 | 0.113 | 0.098 | 0.142 | 0.098 | 0.122 | 0.121 | 0.108 | 0.105 | 0.121 | 0.117 | 0.087 | 0.136 | 0.119 | 0.09 | 0.113 | 0.095 | 0.095 | 0.145 | 0.145 | 0.104 | 0.109 | 0.138 | 0.123 | 0.095 | 0.061 | 0.122 | 0.103 | 0.101 | 0.098 | 0.112 | 0.141 | 0.109 | 0.143 | 0.093 | 0.13 | 0.148 | 0.14 | 0.091 | 0.102 | 0.1 | 0.087 | 0.113 | 0.102 | 0.093 | 0.126 | 0.097 | 0.138 | 0.107 | 0.115 | 0.148 | 0.104 | 0.103 | 0.062 | 0.123 | 0.09 | 0.142 | 0.127 | 0.131 | 0.111 | 0.144 | 0.122 | 0.103 | 0.122 | 0.132 | 0.142 | 0.091 | 0.128 | 0.141 | 0.095 | 0.095 | 0.114 | 0.124 | 0.107 | 0.103 | 0.125 | 0.101 | 0.124 | 0.106 | 0.096 | 0.122 | 0.137 | 0.103 | 0.154 | 0.092 | 0.106 | 0.087 | 0.1 | 0.154 | 0.097 | 0.091 | 0.087 | 0.11 | 0.096 | 0.073 | 0.135 | 0.098 | 0.157 | 0.156 | 0.099 | 0.098 | 0.062 | 0.116 | 0.119 | 0.093 | 0.1 | 0.097 | 0.107 | 0.121 | 0.097 | 0.152 | 0.102 | 0.129 | 0.132 | 0.106 | 0.143 | 0.109 | 0.101 | 0.102 | 0.09 | 0.117 | 0.121 | 0.137 | 0.096 | 0.092 | 0.067 | 0.1 | 0.146 | 0.09 | 0.087 | 0.109 | 0.118 | 0.144 | 0.092 | 0.147 | 0.149 | 0.112 | 0.121 | 0.1 | 0.148 | 0.136 | 0.132 | 0.108 | 0.11 | 0.083 | 0.125 | 0.139 | 0.108 | 0.07 | 0.097 | 0.085 | 0.148 | 0.15 | 0.122 | 0.109 | 0.12 | 0.086 | 0.114 | 0.106 | 0.117 | 0.106 | 0.111 | 0.106 | 0.084 | 0.11 | 0.126 | 0.112 | 0.133 | 0.088 | 0.145 | 0.126 | 0.12 | 0.108 | 0.09 | 0.101 | 0.136 | 0.116 | 0.151 | 0.112 | 0.109 | 0.145 | 0.124 | 0.116 | 0.119 | 0.134 | 0.117 | 0.131 | 0.091 | 0.141 | 0.103 | 0.107 | 0.101 | 0.117 | 0.068 | 0.119 | 0.151 | 0.123 | 0.086 | 0.146 | 0.11 | 0.114 | 0.108 | 0.105 | 0.098 | 0.114 | 0.119 | 0.153 | 0.147 | 0.098 | 0.065 | 0.096 | 0.116 | 0.126 | 0.083 | 0.121 | 0.143 | 0.086 | 0.086 | 0.132 | 0.152 | 0.103 | 0.116 | 0.069 | 0.1 | 0.096 | 0.146 | 0.151 | 0.117 | 0.155 | 0.099 | 0.119 | 0.099 | 0.096 | 0.133 | 0.146 | 0.101 | 0.089 | 0.1 | 0.098 | 0.155 | 0.114 | 0.146 | 0.125 |